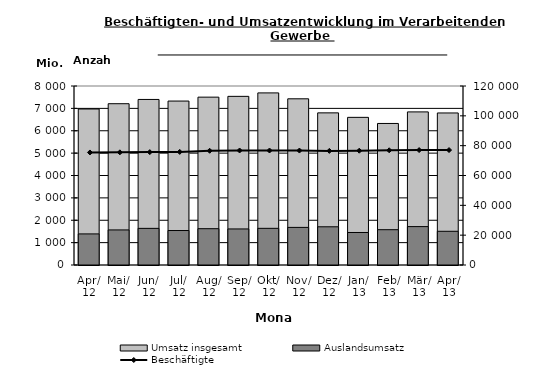
| Category | Umsatz insgesamt | Auslandsumsatz |
|---|---|---|
| 2012-04-01 | 6972.158 | 1389.091 |
| 2012-05-01 | 7208.203 | 1567.272 |
| 2012-06-01 | 7399.131 | 1636.887 |
| 2012-07-01 | 7327.339 | 1540.606 |
| 2012-08-01 | 7501.535 | 1622.307 |
| 2012-09-01 | 7537.073 | 1611.325 |
| 2012-10-01 | 7691.386 | 1638.671 |
| 2012-11-01 | 7427.668 | 1680.559 |
| 2012-12-01 | 6799.178 | 1707.786 |
| 2013-01-01 | 6598.983 | 1453.122 |
| 2013-02-01 | 6326.057 | 1578.148 |
| 2013-03-01 | 6842.406 | 1716.184 |
| 2013-04-01 | 6794.91 | 1506.622 |